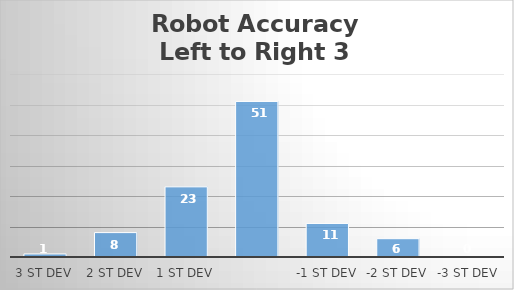
| Category | Series 0 |
|---|---|
| 3 St Dev | 1 |
| 2 St Dev | 8 |
| 1 St Dev | 23 |
|  | 51 |
| -1 St Dev | 11 |
| -2 St Dev | 6 |
| -3 St Dev | 0 |